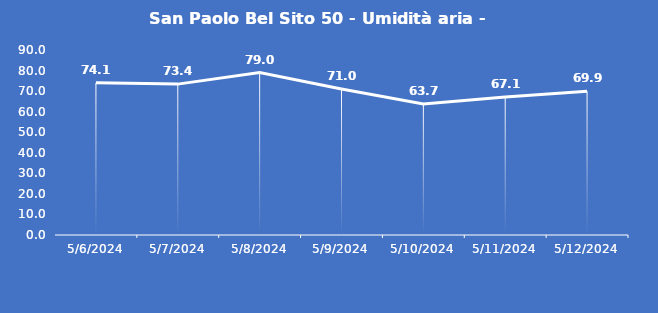
| Category | San Paolo Bel Sito 50 - Umidità aria - Grezzo (%) |
|---|---|
| 5/6/24 | 74.1 |
| 5/7/24 | 73.4 |
| 5/8/24 | 79 |
| 5/9/24 | 71 |
| 5/10/24 | 63.7 |
| 5/11/24 | 67.1 |
| 5/12/24 | 69.9 |